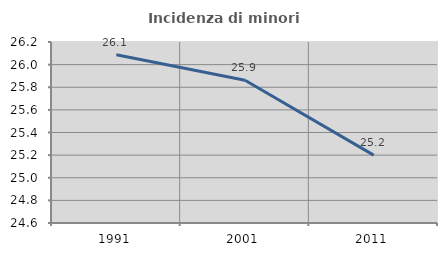
| Category | Incidenza di minori stranieri |
|---|---|
| 1991.0 | 26.087 |
| 2001.0 | 25.862 |
| 2011.0 | 25.2 |